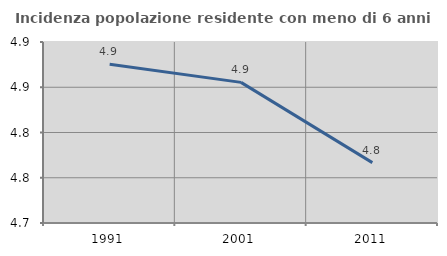
| Category | Incidenza popolazione residente con meno di 6 anni |
|---|---|
| 1991.0 | 4.876 |
| 2001.0 | 4.855 |
| 2011.0 | 4.767 |